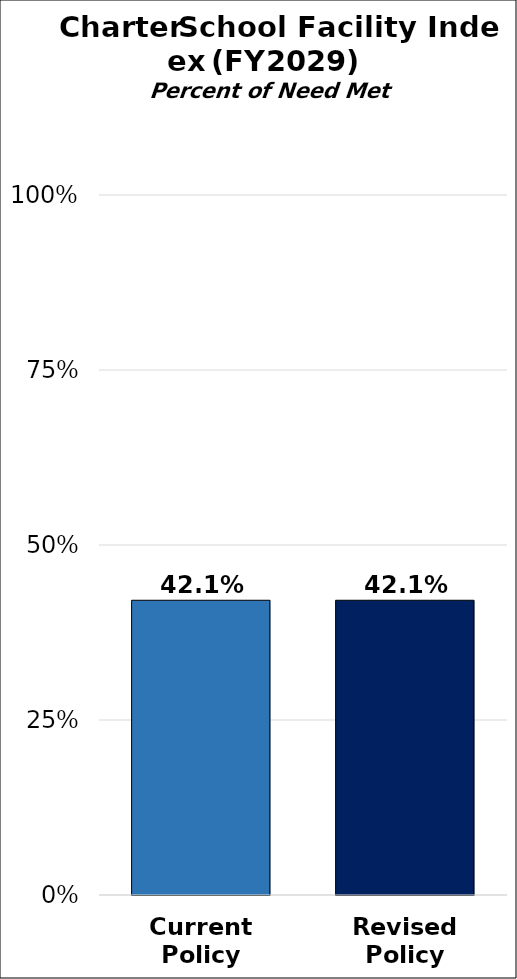
| Category | Total Need Met |
|---|---|
| Current
Policy | 0.421 |
| Revised
Policy | 0.421 |